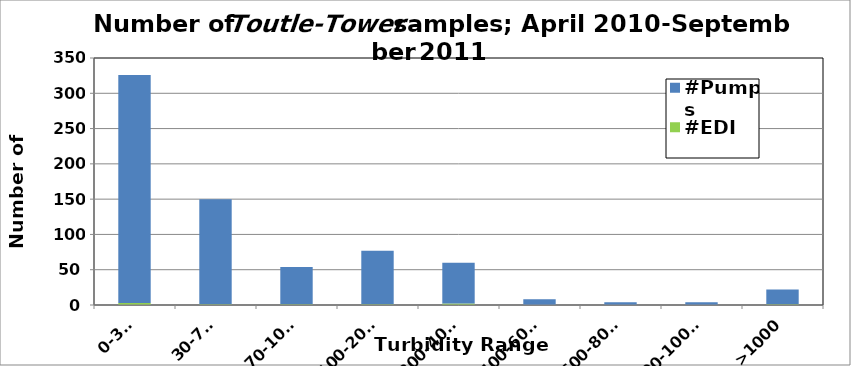
| Category | #EDI | #Pumps |
|---|---|---|
| 0-30, | 3 | 323 |
| 30-70, | 1 | 149 |
| 70-100, | 1 | 53 |
| 100-200, | 1 | 76 |
| 200-400, | 2 | 58 |
| 400-600, | 0 | 8 |
| 600-800, | 0 | 4 |
| 800-1000, | 0 | 4 |
| >1000 | 1 | 21 |